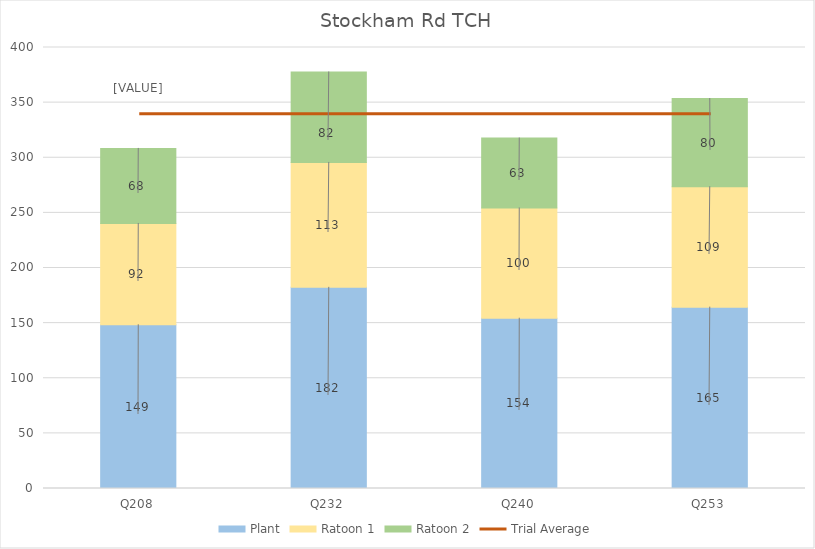
| Category | Plant | Ratoon 1 | Ratoon 2 |
|---|---|---|---|
| Q208 | 148.516 | 91.896 | 68.043 |
| Q232 | 182.457 | 113.29 | 82.039 |
| Q240 | 154.453 | 99.974 | 63.45 |
| Q253 | 164.505 | 109.177 | 80.009 |